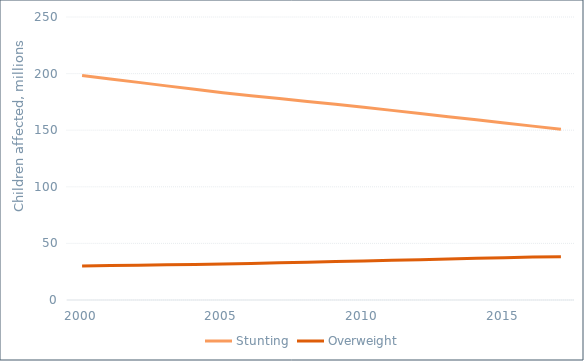
| Category | Stunting | Overweight |
|---|---|---|
| 2000.0 | 198.4 | 30.1 |
| 2001.0 | 195.32 | 30.42 |
| 2002.0 | 192.24 | 30.74 |
| 2003.0 | 189.16 | 31.06 |
| 2004.0 | 186.08 | 31.38 |
| 2005.0 | 183 | 31.7 |
| 2006.0 | 180.46 | 32.26 |
| 2007.0 | 177.92 | 32.82 |
| 2008.0 | 175.38 | 33.38 |
| 2009.0 | 172.84 | 33.94 |
| 2010.0 | 170.3 | 34.5 |
| 2011.0 | 167.52 | 35.08 |
| 2012.0 | 164.74 | 35.66 |
| 2013.0 | 161.96 | 36.24 |
| 2014.0 | 159.18 | 36.82 |
| 2015.0 | 156.4 | 37.4 |
| 2016.0 | 153.6 | 37.9 |
| 2017.0 | 150.8 | 38.3 |